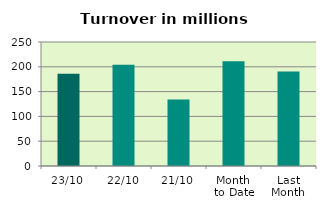
| Category | Series 0 |
|---|---|
| 23/10 | 185.851 |
| 22/10 | 204.125 |
| 21/10 | 134.003 |
| Month 
to Date | 211.099 |
| Last
Month | 190.73 |